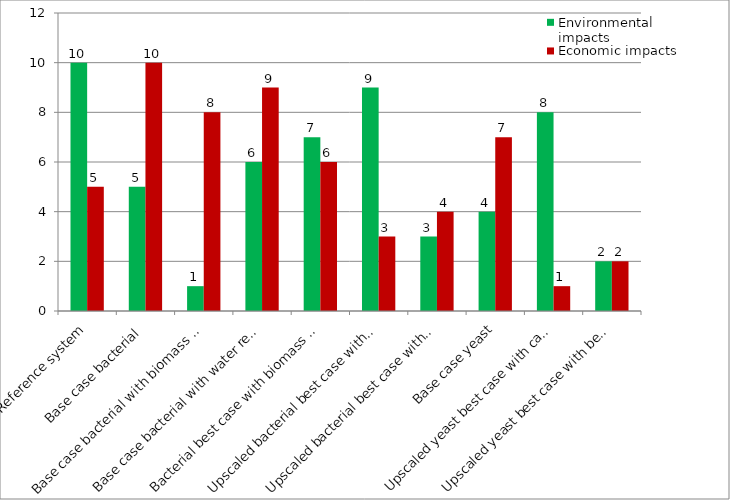
| Category | Environmental impacts | Economic impacts |
|---|---|---|
| Reference system | 10 | 5 |
| Base case bacterial | 5 | 10 |
| Base case bacterial with biomass recycling | 1 | 8 |
| Base case bacterial with water recycling | 6 | 9 |
| Bacterial best case with biomass and water recycling and cane sugar | 7 | 6 |
| Upscaled bacterial best case with cane sugar | 9 | 3 |
| Upscaled bacterial best case with beet sugar | 3 | 4 |
| Base case yeast | 4 | 7 |
| Upscaled yeast best case with cane sugar | 8 | 1 |
| Upscaled yeast best case with beet sugar | 2 | 2 |